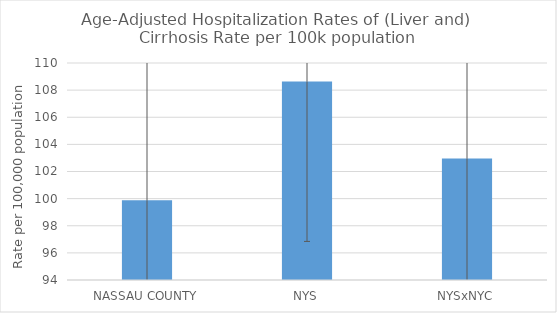
| Category | Age-Adjusted Hospitalization Rates of (Liver and) Cirrhosis Rate per 100k population |
|---|---|
| NASSAU COUNTY | 99.881 |
| NYS | 108.64 |
| NYSxNYC | 102.966 |